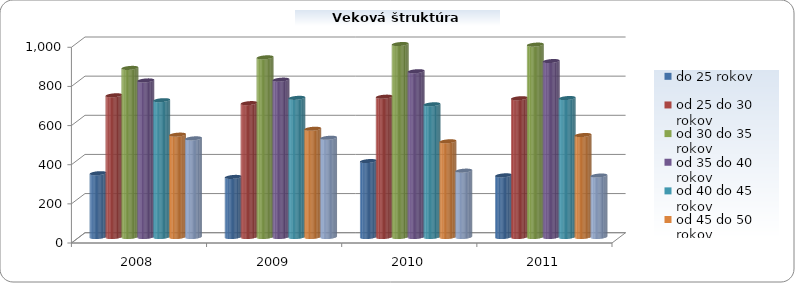
| Category | do 25 rokov | od 25 do 30 rokov | od 30 do 35 rokov | od 35 do 40 rokov | od 40 do 45 rokov | od 45 do 50 rokov | nad 50 rokov |
|---|---|---|---|---|---|---|---|
| 2008.0 | 326 | 724 | 864 | 800 | 699 | 523 | 504 |
| 2009.0 | 307 | 684 | 918 | 804 | 711 | 553 | 507 |
| 2010.0 | 388 | 717 | 986 | 847 | 678 | 489 | 339 |
| 2011.0 | 315 | 709 | 983 | 899 | 710 | 521 | 314 |